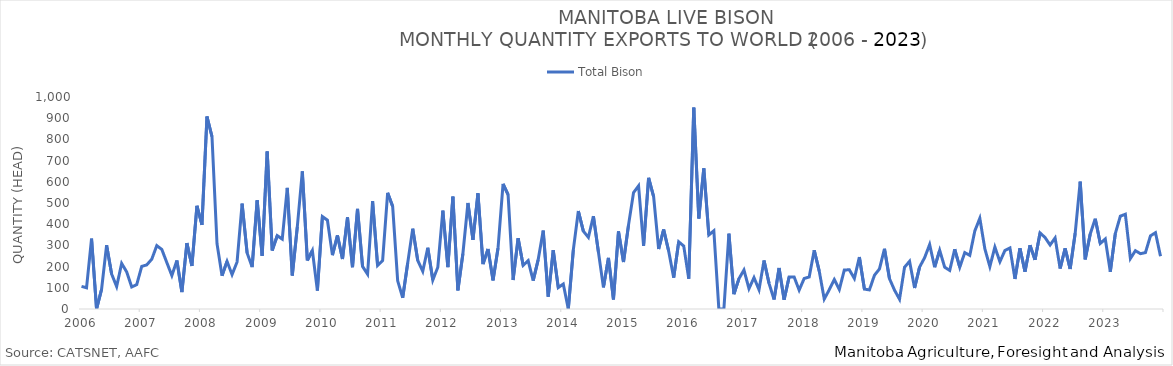
| Category | Total Bison |
|---|---|
| 2006-01-01 | 107 |
| 2006-02-01 | 100 |
| 2006-03-01 | 332 |
| 2006-04-01 | 0 |
| 2006-05-01 | 93 |
| 2006-06-01 | 301 |
| 2006-07-01 | 165 |
| 2006-08-01 | 106 |
| 2006-09-01 | 215 |
| 2006-10-01 | 175 |
| 2006-11-01 | 104 |
| 2006-12-01 | 115 |
| 2007-01-01 | 201 |
| 2007-02-01 | 208 |
| 2007-03-01 | 235 |
| 2007-04-01 | 299 |
| 2007-05-01 | 281 |
| 2007-06-01 | 219 |
| 2007-07-01 | 158 |
| 2007-08-01 | 229 |
| 2007-09-01 | 80 |
| 2007-10-01 | 311 |
| 2007-11-01 | 203 |
| 2007-12-01 | 487 |
| 2008-01-01 | 397 |
| 2008-02-01 | 908 |
| 2008-03-01 | 813 |
| 2008-04-01 | 308 |
| 2008-05-01 | 157 |
| 2008-06-01 | 225 |
| 2008-07-01 | 162 |
| 2008-08-01 | 222 |
| 2008-09-01 | 497 |
| 2008-10-01 | 264 |
| 2008-11-01 | 198 |
| 2008-12-01 | 513 |
| 2009-01-01 | 251 |
| 2009-02-01 | 743 |
| 2009-03-01 | 276 |
| 2009-04-01 | 346 |
| 2009-05-01 | 330 |
| 2009-06-01 | 571 |
| 2009-07-01 | 158 |
| 2009-08-01 | 387 |
| 2009-09-01 | 649 |
| 2009-10-01 | 229 |
| 2009-11-01 | 276 |
| 2009-12-01 | 87 |
| 2010-01-01 | 436 |
| 2010-02-01 | 419 |
| 2010-03-01 | 254 |
| 2010-04-01 | 347 |
| 2010-05-01 | 236 |
| 2010-06-01 | 432 |
| 2010-07-01 | 197 |
| 2010-08-01 | 472 |
| 2010-09-01 | 201 |
| 2010-10-01 | 164 |
| 2010-11-01 | 509 |
| 2010-12-01 | 205 |
| 2011-01-01 | 228 |
| 2011-02-01 | 548 |
| 2011-03-01 | 484 |
| 2011-04-01 | 133 |
| 2011-05-01 | 53 |
| 2011-06-01 | 217 |
| 2011-07-01 | 379 |
| 2011-08-01 | 229 |
| 2011-09-01 | 178 |
| 2011-10-01 | 289 |
| 2011-11-01 | 137 |
| 2011-12-01 | 197 |
| 2012-01-01 | 464 |
| 2012-02-01 | 198 |
| 2012-03-01 | 530 |
| 2012-04-01 | 88 |
| 2012-05-01 | 262 |
| 2012-06-01 | 500 |
| 2012-07-01 | 326 |
| 2012-08-01 | 546 |
| 2012-09-01 | 212 |
| 2012-10-01 | 283 |
| 2012-11-01 | 135 |
| 2012-12-01 | 288 |
| 2013-01-01 | 590 |
| 2013-02-01 | 539 |
| 2013-03-01 | 137 |
| 2013-04-01 | 334 |
| 2013-05-01 | 206 |
| 2013-06-01 | 228 |
| 2013-07-01 | 134 |
| 2013-08-01 | 233 |
| 2013-09-01 | 370 |
| 2013-10-01 | 58 |
| 2013-11-01 | 277 |
| 2013-12-01 | 101 |
| 2014-01-01 | 118 |
| 2014-02-01 | 0 |
| 2014-03-01 | 279 |
| 2014-04-01 | 462 |
| 2014-05-01 | 367 |
| 2014-06-01 | 338 |
| 2014-07-01 | 438 |
| 2014-08-01 | 269 |
| 2014-09-01 | 102 |
| 2014-10-01 | 241 |
| 2014-11-01 | 45 |
| 2014-12-01 | 366 |
| 2015-01-01 | 222 |
| 2015-02-01 | 397 |
| 2015-03-01 | 549 |
| 2015-04-01 | 581 |
| 2015-05-01 | 298 |
| 2015-06-01 | 619 |
| 2015-07-01 | 530 |
| 2015-08-01 | 283 |
| 2015-09-01 | 375 |
| 2015-10-01 | 273 |
| 2015-11-01 | 148 |
| 2015-12-01 | 317 |
| 2016-01-01 | 297 |
| 2016-02-01 | 143 |
| 2016-03-01 | 950 |
| 2016-04-01 | 427 |
| 2016-05-01 | 663 |
| 2016-06-01 | 349 |
| 2016-07-01 | 369 |
| 2016-08-01 | 0 |
| 2016-09-01 | 0 |
| 2016-10-01 | 355 |
| 2016-11-01 | 70 |
| 2016-12-01 | 143 |
| 2017-01-01 | 184 |
| 2017-02-01 | 96 |
| 2017-03-01 | 148 |
| 2017-04-01 | 91 |
| 2017-05-01 | 229 |
| 2017-06-01 | 121 |
| 2017-07-01 | 45 |
| 2017-08-01 | 193 |
| 2017-09-01 | 44 |
| 2017-10-01 | 151 |
| 2017-11-01 | 151 |
| 2017-12-01 | 89 |
| 2018-01-01 | 144 |
| 2018-02-01 | 151 |
| 2018-03-01 | 277 |
| 2018-04-01 | 179 |
| 2018-05-01 | 47 |
| 2018-06-01 | 91 |
| 2018-07-01 | 139 |
| 2018-08-01 | 92 |
| 2018-09-01 | 184 |
| 2018-10-01 | 185 |
| 2018-11-01 | 144 |
| 2018-12-01 | 245 |
| 2019-01-01 | 94 |
| 2019-02-01 | 90 |
| 2019-03-01 | 159 |
| 2019-04-01 | 189 |
| 2019-05-01 | 284 |
| 2019-06-01 | 143 |
| 2019-07-01 | 89 |
| 2019-08-01 | 46 |
| 2019-09-01 | 197 |
| 2019-10-01 | 225 |
| 2019-11-01 | 99 |
| 2019-12-01 | 198 |
| 2020-01-01 | 242 |
| 2020-02-01 | 304 |
| 2020-03-01 | 197 |
| 2020-04-01 | 277 |
| 2020-05-01 | 197 |
| 2020-06-01 | 182 |
| 2020-07-01 | 282 |
| 2020-08-01 | 197 |
| 2020-09-01 | 266 |
| 2020-10-01 | 253 |
| 2020-11-01 | 368 |
| 2020-12-01 | 428 |
| 2021-01-01 | 284 |
| 2021-02-01 | 200 |
| 2021-03-01 | 292 |
| 2021-04-01 | 223 |
| 2021-05-01 | 276 |
| 2021-06-01 | 288 |
| 2021-07-01 | 142 |
| 2021-08-01 | 286 |
| 2021-09-01 | 176 |
| 2021-10-01 | 301 |
| 2021-11-01 | 232 |
| 2021-12-01 | 359 |
| 2022-01-01 | 337 |
| 2022-02-01 | 302 |
| 2022-03-01 | 335 |
| 2022-04-01 | 191 |
| 2022-05-01 | 286 |
| 2022-06-01 | 189 |
| 2022-07-01 | 357 |
| 2022-08-01 | 601 |
| 2022-09-01 | 234 |
| 2022-10-01 | 354 |
| 2022-11-01 | 426 |
| 2022-12-01 | 309 |
| 2023-01-01 | 330 |
| 2023-02-01 | 176 |
| 2023-03-01 | 356 |
| 2023-04-01 | 438 |
| 2023-05-01 | 447 |
| 2023-06-01 | 238 |
| 2023-07-01 | 275 |
| 2023-08-01 | 261 |
| 2023-09-01 | 266 |
| 2023-10-01 | 345 |
| 2023-11-01 | 360 |
| 2023-12-01 | 249 |